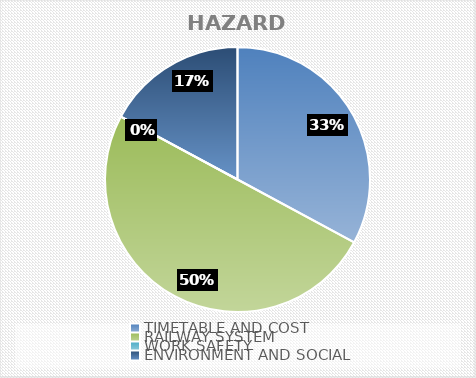
| Category | HAZARD TYPE |
|---|---|
| TIMETABLE AND COST | 23 |
| RAILWAY SYSTEM | 35 |
| WORK SAFETY | 0 |
| ENVIRONMENT AND SOCIAL | 12 |